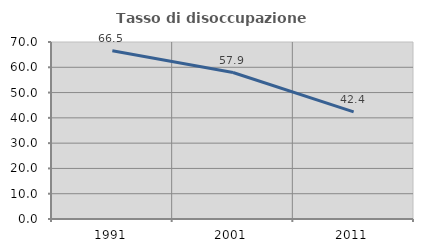
| Category | Tasso di disoccupazione giovanile  |
|---|---|
| 1991.0 | 66.517 |
| 2001.0 | 57.925 |
| 2011.0 | 42.366 |